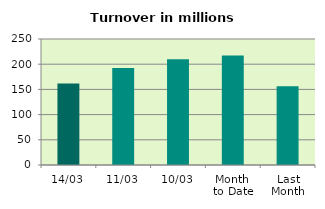
| Category | Series 0 |
|---|---|
| 14/03 | 161.646 |
| 11/03 | 192.462 |
| 10/03 | 209.82 |
| Month 
to Date | 217.383 |
| Last
Month | 156.222 |